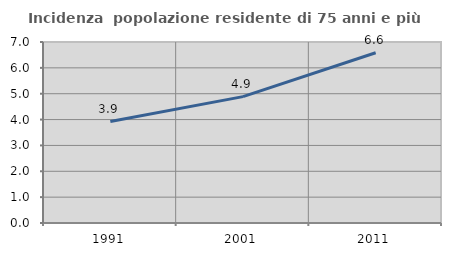
| Category | Incidenza  popolazione residente di 75 anni e più |
|---|---|
| 1991.0 | 3.922 |
| 2001.0 | 4.887 |
| 2011.0 | 6.583 |